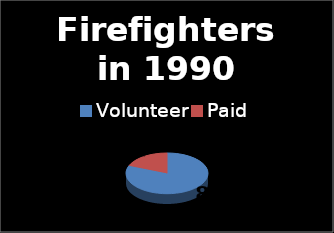
| Category | Series 0 |
|---|---|
| Volunteer | 0.811 |
| Paid | 0.189 |